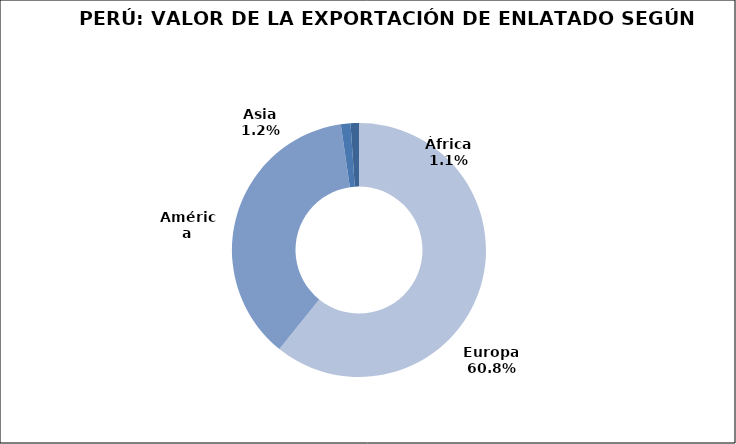
| Category | Series 0 |
|---|---|
| Europa | 37194.083 |
| América | 22601.101 |
| Asia | 749.869 |
| África | 652.228 |